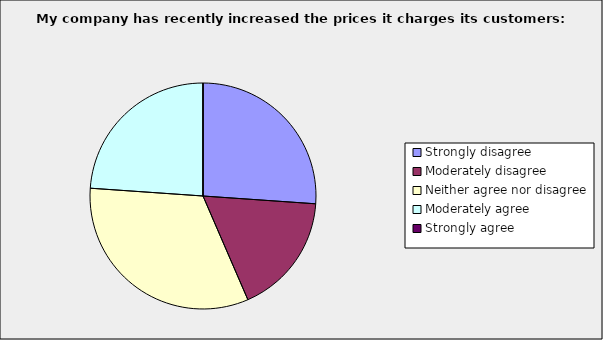
| Category | Series 0 |
|---|---|
| Strongly disagree | 0.261 |
| Moderately disagree | 0.174 |
| Neither agree nor disagree | 0.326 |
| Moderately agree | 0.239 |
| Strongly agree | 0 |